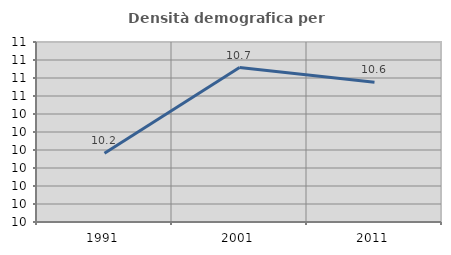
| Category | Densità demografica |
|---|---|
| 1991.0 | 10.182 |
| 2001.0 | 10.658 |
| 2011.0 | 10.576 |